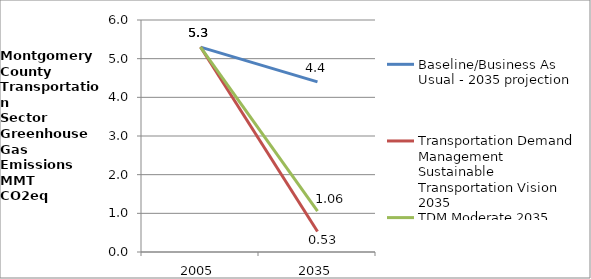
| Category | Baseline/Business As Usual - 2035 projection | Transportation Demand Management Sustainable Transportation Vision 2035 | TDM Moderate 2035 |
|---|---|---|---|
| 2005.0 | 5.3 | 5.3 | 5.3 |
| 2035.0 | 4.399 | 0.53 | 1.06 |